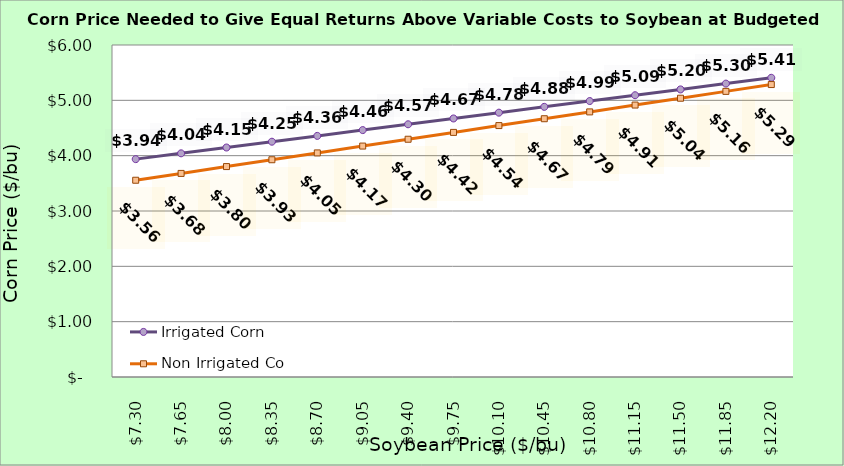
| Category | Irrigated Corn | Non Irrigated Corn |
|---|---|---|
| 7.3000000000000025 | 3.937 | 3.556 |
| 7.650000000000002 | 4.042 | 3.679 |
| 8.000000000000002 | 4.147 | 3.803 |
| 8.350000000000001 | 4.252 | 3.926 |
| 8.700000000000001 | 4.357 | 4.05 |
| 9.05 | 4.462 | 4.173 |
| 9.4 | 4.567 | 4.297 |
| 9.75 | 4.672 | 4.42 |
| 10.1 | 4.777 | 4.544 |
| 10.45 | 4.882 | 4.668 |
| 10.799999999999999 | 4.987 | 4.791 |
| 11.149999999999999 | 5.092 | 4.915 |
| 11.499999999999998 | 5.197 | 5.038 |
| 11.849999999999998 | 5.302 | 5.162 |
| 12.199999999999998 | 5.407 | 5.285 |